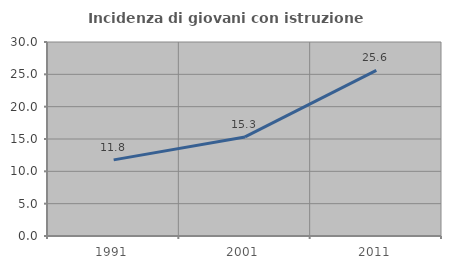
| Category | Incidenza di giovani con istruzione universitaria |
|---|---|
| 1991.0 | 11.771 |
| 2001.0 | 15.318 |
| 2011.0 | 25.605 |